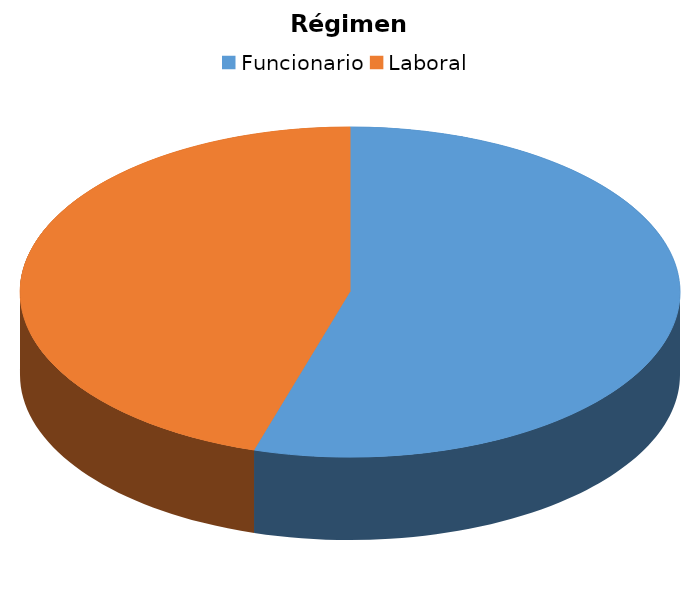
| Category | Régimen Jurídico |
|---|---|
| Funcionario | 140 |
| Laboral | 116 |